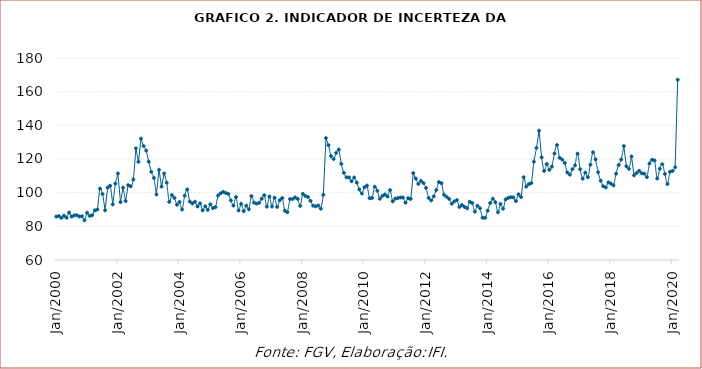
| Category | Indicador de incerteza da economia |
|---|---|
| 2000-01-01 | 85.8 |
| 2000-02-01 | 86.1 |
| 2000-03-01 | 85 |
| 2000-04-01 | 86.3 |
| 2000-05-01 | 85.1 |
| 2000-06-01 | 88.2 |
| 2000-07-01 | 85.8 |
| 2000-08-01 | 86.5 |
| 2000-09-01 | 86.6 |
| 2000-10-01 | 85.8 |
| 2000-11-01 | 86 |
| 2000-12-01 | 83.6 |
| 2001-01-01 | 88.1 |
| 2001-02-01 | 86.2 |
| 2001-03-01 | 86.6 |
| 2001-04-01 | 89.5 |
| 2001-05-01 | 90 |
| 2001-06-01 | 102.4 |
| 2001-07-01 | 99.2 |
| 2001-08-01 | 89.5 |
| 2001-09-01 | 103 |
| 2001-10-01 | 104.1 |
| 2001-11-01 | 93 |
| 2001-12-01 | 105.4 |
| 2002-01-01 | 111.4 |
| 2002-02-01 | 94.4 |
| 2002-03-01 | 103 |
| 2002-04-01 | 95 |
| 2002-05-01 | 104.5 |
| 2002-06-01 | 103.8 |
| 2002-07-01 | 107.8 |
| 2002-08-01 | 126.3 |
| 2002-09-01 | 118.3 |
| 2002-10-01 | 132.1 |
| 2002-11-01 | 127.7 |
| 2002-12-01 | 125 |
| 2003-01-01 | 118.4 |
| 2003-02-01 | 112.4 |
| 2003-03-01 | 108.8 |
| 2003-04-01 | 98.9 |
| 2003-05-01 | 113.6 |
| 2003-06-01 | 103.6 |
| 2003-07-01 | 111.4 |
| 2003-08-01 | 105.9 |
| 2003-09-01 | 94.5 |
| 2003-10-01 | 98.6 |
| 2003-11-01 | 96.9 |
| 2003-12-01 | 92.8 |
| 2004-01-01 | 94.5 |
| 2004-02-01 | 90 |
| 2004-03-01 | 98.2 |
| 2004-04-01 | 101.9 |
| 2004-05-01 | 94.7 |
| 2004-06-01 | 93.6 |
| 2004-07-01 | 94.6 |
| 2004-08-01 | 91.8 |
| 2004-09-01 | 93.6 |
| 2004-10-01 | 89.5 |
| 2004-11-01 | 91.9 |
| 2004-12-01 | 89.8 |
| 2005-01-01 | 93.1 |
| 2005-02-01 | 90.8 |
| 2005-03-01 | 91.4 |
| 2005-04-01 | 98.3 |
| 2005-05-01 | 99.6 |
| 2005-06-01 | 100.4 |
| 2005-07-01 | 99.8 |
| 2005-08-01 | 99.3 |
| 2005-09-01 | 95.4 |
| 2005-10-01 | 92.3 |
| 2005-11-01 | 97.4 |
| 2005-12-01 | 89.4 |
| 2006-01-01 | 93.4 |
| 2006-02-01 | 89 |
| 2006-03-01 | 92.3 |
| 2006-04-01 | 90.1 |
| 2006-05-01 | 98 |
| 2006-06-01 | 94.1 |
| 2006-07-01 | 93.5 |
| 2006-08-01 | 94 |
| 2006-09-01 | 96.4 |
| 2006-10-01 | 98.5 |
| 2006-11-01 | 91.7 |
| 2006-12-01 | 97.7 |
| 2007-01-01 | 91.8 |
| 2007-02-01 | 97 |
| 2007-03-01 | 91.5 |
| 2007-04-01 | 95.5 |
| 2007-05-01 | 96.8 |
| 2007-06-01 | 89.3 |
| 2007-07-01 | 88.4 |
| 2007-08-01 | 96.2 |
| 2007-09-01 | 96.2 |
| 2007-10-01 | 97.2 |
| 2007-11-01 | 96.3 |
| 2007-12-01 | 92.1 |
| 2008-01-01 | 99.3 |
| 2008-02-01 | 98 |
| 2008-03-01 | 97.4 |
| 2008-04-01 | 95.1 |
| 2008-05-01 | 92.3 |
| 2008-06-01 | 91.9 |
| 2008-07-01 | 92.4 |
| 2008-08-01 | 90.5 |
| 2008-09-01 | 98.7 |
| 2008-10-01 | 132.4 |
| 2008-11-01 | 128.2 |
| 2008-12-01 | 121.8 |
| 2009-01-01 | 120 |
| 2009-02-01 | 123.6 |
| 2009-03-01 | 125.6 |
| 2009-04-01 | 117.1 |
| 2009-05-01 | 111.8 |
| 2009-06-01 | 109.1 |
| 2009-07-01 | 109 |
| 2009-08-01 | 106.8 |
| 2009-09-01 | 109 |
| 2009-10-01 | 106 |
| 2009-11-01 | 101.9 |
| 2009-12-01 | 99.5 |
| 2010-01-01 | 103.2 |
| 2010-02-01 | 104.2 |
| 2010-03-01 | 96.7 |
| 2010-04-01 | 96.9 |
| 2010-05-01 | 103.5 |
| 2010-06-01 | 101.2 |
| 2010-07-01 | 96.4 |
| 2010-08-01 | 98.1 |
| 2010-09-01 | 98.9 |
| 2010-10-01 | 97.7 |
| 2010-11-01 | 101.5 |
| 2010-12-01 | 94.8 |
| 2011-01-01 | 96.4 |
| 2011-02-01 | 96.8 |
| 2011-03-01 | 97.1 |
| 2011-04-01 | 97.1 |
| 2011-05-01 | 94.1 |
| 2011-06-01 | 96.7 |
| 2011-07-01 | 96.3 |
| 2011-08-01 | 111.6 |
| 2011-09-01 | 108.4 |
| 2011-10-01 | 105.2 |
| 2011-11-01 | 107 |
| 2011-12-01 | 105.7 |
| 2012-01-01 | 102.8 |
| 2012-02-01 | 96.9 |
| 2012-03-01 | 95.4 |
| 2012-04-01 | 97.8 |
| 2012-05-01 | 101.6 |
| 2012-06-01 | 106.3 |
| 2012-07-01 | 105.6 |
| 2012-08-01 | 98.8 |
| 2012-09-01 | 97.5 |
| 2012-10-01 | 96.3 |
| 2012-11-01 | 93.4 |
| 2012-12-01 | 94.8 |
| 2013-01-01 | 95.6 |
| 2013-02-01 | 91.5 |
| 2013-03-01 | 92.6 |
| 2013-04-01 | 91.5 |
| 2013-05-01 | 90.7 |
| 2013-06-01 | 94.6 |
| 2013-07-01 | 93.8 |
| 2013-08-01 | 88.7 |
| 2013-09-01 | 92.2 |
| 2013-10-01 | 90.7 |
| 2013-11-01 | 85.1 |
| 2013-12-01 | 85.1 |
| 2014-01-01 | 89.3 |
| 2014-02-01 | 93.9 |
| 2014-03-01 | 96.4 |
| 2014-04-01 | 94.3 |
| 2014-05-01 | 88.3 |
| 2014-06-01 | 93.3 |
| 2014-07-01 | 90.5 |
| 2014-08-01 | 96 |
| 2014-09-01 | 96.9 |
| 2014-10-01 | 97.3 |
| 2014-11-01 | 97.2 |
| 2014-12-01 | 95 |
| 2015-01-01 | 99 |
| 2015-02-01 | 97.4 |
| 2015-03-01 | 109.2 |
| 2015-04-01 | 103.6 |
| 2015-05-01 | 105.1 |
| 2015-06-01 | 105.7 |
| 2015-07-01 | 118.4 |
| 2015-08-01 | 126.6 |
| 2015-09-01 | 136.8 |
| 2015-10-01 | 121 |
| 2015-11-01 | 112.9 |
| 2015-12-01 | 117 |
| 2016-01-01 | 113.6 |
| 2016-02-01 | 115.5 |
| 2016-03-01 | 123.3 |
| 2016-04-01 | 128.3 |
| 2016-05-01 | 120.7 |
| 2016-06-01 | 119.7 |
| 2016-07-01 | 117.7 |
| 2016-08-01 | 112 |
| 2016-09-01 | 110.7 |
| 2016-10-01 | 114 |
| 2016-11-01 | 116.2 |
| 2016-12-01 | 123.2 |
| 2017-01-01 | 113.9 |
| 2017-02-01 | 108.3 |
| 2017-03-01 | 111.9 |
| 2017-04-01 | 109.2 |
| 2017-05-01 | 116.6 |
| 2017-06-01 | 124 |
| 2017-07-01 | 119.8 |
| 2017-08-01 | 112.1 |
| 2017-09-01 | 107.1 |
| 2017-10-01 | 103.8 |
| 2017-11-01 | 103.1 |
| 2017-12-01 | 106.1 |
| 2018-01-01 | 105.4 |
| 2018-02-01 | 104.3 |
| 2018-03-01 | 111.3 |
| 2018-04-01 | 116.4 |
| 2018-05-01 | 119.7 |
| 2018-06-01 | 127.7 |
| 2018-07-01 | 115.7 |
| 2018-08-01 | 114.2 |
| 2018-09-01 | 121.5 |
| 2018-10-01 | 110.3 |
| 2018-11-01 | 111.7 |
| 2018-12-01 | 113 |
| 2019-01-01 | 111.5 |
| 2019-02-01 | 111.3 |
| 2019-03-01 | 109.2 |
| 2019-04-01 | 117.3 |
| 2019-05-01 | 119.5 |
| 2019-06-01 | 119.1 |
| 2019-07-01 | 108.4 |
| 2019-08-01 | 114.2 |
| 2019-09-01 | 116.9 |
| 2019-10-01 | 111.1 |
| 2019-11-01 | 105.1 |
| 2019-12-01 | 112.4 |
| 2020-01-01 | 112.9 |
| 2020-02-01 | 115.1 |
| 2020-03-01 | 167.1 |